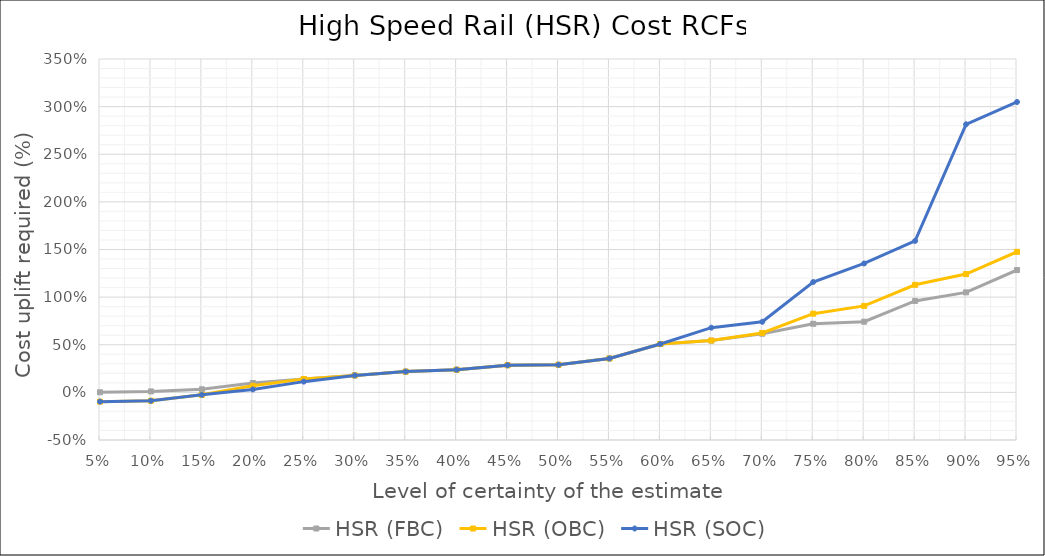
| Category | HSR (FBC) | HSR (OBC) | HSR (SOC) |
|---|---|---|---|
| 0.05 | 0.001 | -0.097 | -0.097 |
| 0.1 | 0.01 | -0.088 | -0.088 |
| 0.15 | 0.032 | -0.026 | -0.026 |
| 0.2 | 0.098 | 0.069 | 0.031 |
| 0.25 | 0.14 | 0.14 | 0.113 |
| 0.3 | 0.178 | 0.178 | 0.178 |
| 0.35 | 0.218 | 0.218 | 0.218 |
| 0.4 | 0.238 | 0.238 | 0.238 |
| 0.45 | 0.285 | 0.285 | 0.285 |
| 0.5 | 0.29 | 0.29 | 0.29 |
| 0.55 | 0.356 | 0.356 | 0.356 |
| 0.6 | 0.508 | 0.508 | 0.508 |
| 0.65 | 0.544 | 0.544 | 0.679 |
| 0.7 | 0.616 | 0.624 | 0.741 |
| 0.75 | 0.72 | 0.826 | 1.159 |
| 0.8 | 0.742 | 0.908 | 1.353 |
| 0.85 | 0.96 | 1.129 | 1.59 |
| 0.9 | 1.05 | 1.242 | 2.815 |
| 0.95 | 1.284 | 1.476 | 3.049 |